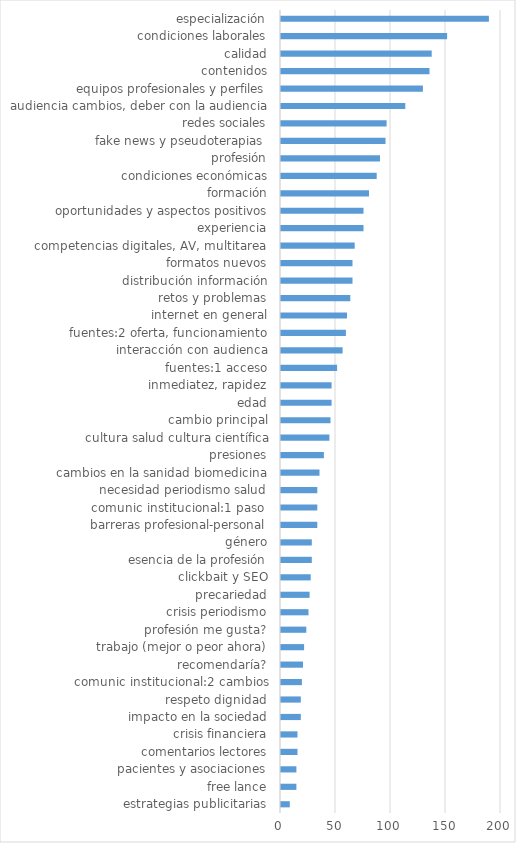
| Category | Series 0 |
|---|---|
| estrategias publicitarias | 8 |
| free lance | 14 |
| pacientes y asociaciones | 14 |
| comentarios lectores | 15 |
| crisis financiera | 15 |
| impacto en la sociedad | 18 |
| respeto dignidad | 18 |
| comunic institucional:2 cambios | 19 |
| recomendaría? | 20 |
| trabajo (mejor o peor ahora) | 21 |
| profesión me gusta? | 23 |
| crisis periodismo | 25 |
| precariedad | 26 |
| clickbait y SEO | 27 |
| esencia de la profesión | 28 |
| género | 28 |
| barreras profesional-personal | 33 |
| comunic institucional:1 paso  | 33 |
| necesidad periodismo salud | 33 |
| cambios en la sanidad biomedicina | 35 |
| presiones | 39 |
| cultura salud cultura científica | 44 |
| cambio principal | 45 |
| edad | 46 |
| inmediatez, rapidez | 46 |
| fuentes:1 acceso | 51 |
| interacción con audienca | 56 |
| fuentes:2 oferta, funcionamiento | 59 |
| internet en general | 60 |
| retos y problemas | 63 |
| distribución información | 65 |
| formatos nuevos | 65 |
| competencias digitales, AV, multitarea | 67 |
| experiencia | 75 |
| oportunidades y aspectos positivos | 75 |
| formación | 80 |
| condiciones económicas | 87 |
| profesión | 90 |
| fake news y pseudoterapias  | 95 |
| redes sociales | 96 |
| audiencia cambios, deber con la audiencia | 113 |
| equipos profesionales y perfiles | 129 |
| contenidos | 135 |
| calidad | 137 |
| condiciones laborales | 151 |
| especialización | 189 |